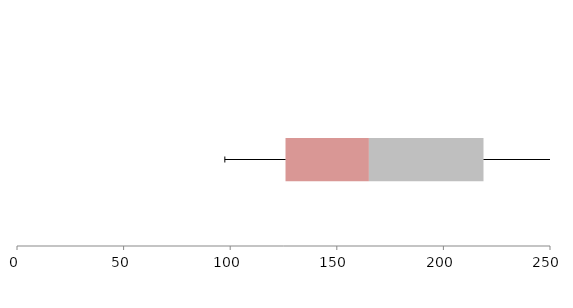
| Category | Series 1 | Series 2 | Series 3 |
|---|---|---|---|
| 0 | 125.946 | 39.114 | 53.746 |